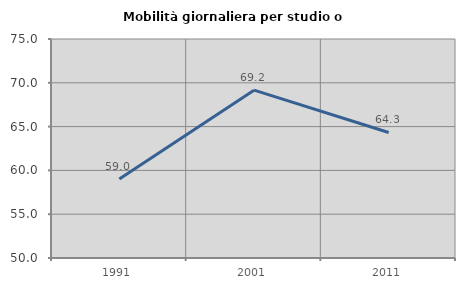
| Category | Mobilità giornaliera per studio o lavoro |
|---|---|
| 1991.0 | 59.026 |
| 2001.0 | 69.159 |
| 2011.0 | 64.329 |